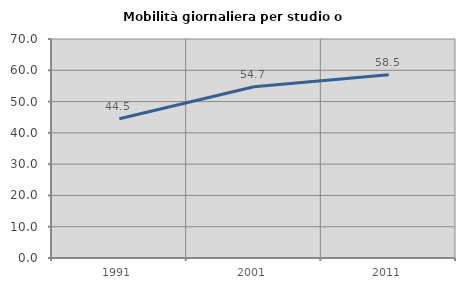
| Category | Mobilità giornaliera per studio o lavoro |
|---|---|
| 1991.0 | 44.486 |
| 2001.0 | 54.746 |
| 2011.0 | 58.543 |